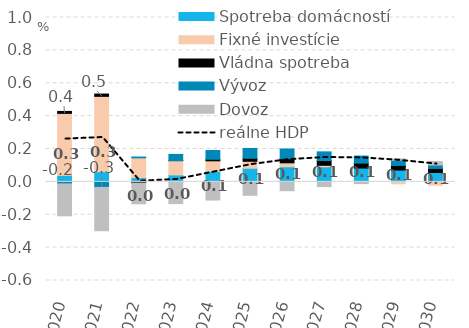
| Category | Spotreba domácností | Fixné investície | Vládna spotreba | Vývoz | Dovoz |
|---|---|---|---|---|---|
| 2020.0 | 0.039 | 0.377 | 0.012 | -0.012 | -0.194 |
| 2021.0 | 0.061 | 0.459 | 0.014 | -0.034 | -0.263 |
| 2022.0 | 0.026 | 0.121 | -0.007 | 0.005 | -0.126 |
| 2023.0 | 0.042 | 0.087 | 0.001 | 0.037 | -0.132 |
| 2024.0 | 0.064 | 0.064 | 0.009 | 0.053 | -0.111 |
| 2025.0 | 0.083 | 0.042 | 0.018 | 0.06 | -0.082 |
| 2026.0 | 0.092 | 0.024 | 0.025 | 0.059 | -0.054 |
| 2027.0 | 0.092 | 0.009 | 0.029 | 0.053 | -0.029 |
| 2028.0 | 0.084 | -0.002 | 0.03 | 0.043 | -0.008 |
| 2029.0 | 0.072 | -0.012 | 0.028 | 0.032 | 0.008 |
| 2030.0 | 0.057 | -0.02 | 0.024 | 0.021 | 0.021 |